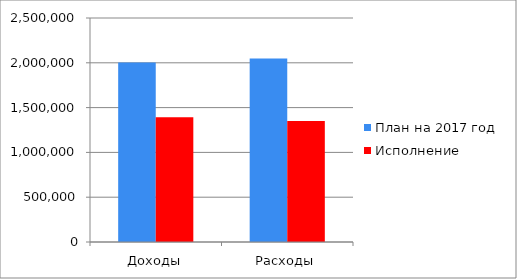
| Category | План на 2017 год | Исполнение |
|---|---|---|
| Доходы | 2002031 | 1391185 |
| Расходы | 2047517 | 1350186 |